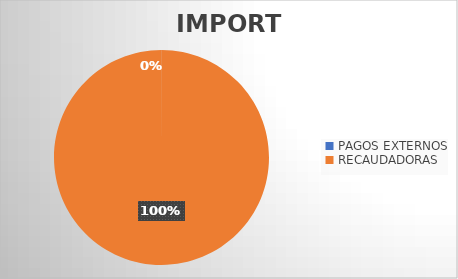
| Category | IMPORTE |
|---|---|
| PAGOS EXTERNOS | 234362.32 |
| RECAUDADORAS | 1067691771 |